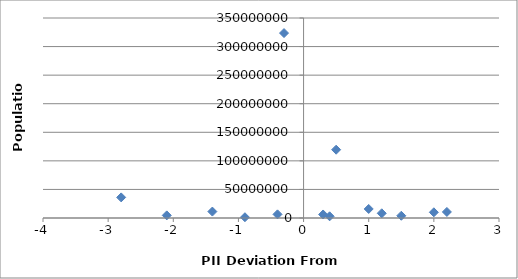
| Category | Population |
|---|---|
| -2.8 | 36048521 |
| -0.2999999999999998 | 323625762 |
| 0.5 | 119530753 |
| -1.3999999999999995 | 11238317 |
| 0.40000000000000036 | 2950210 |
| -2.0999999999999996 | 4586353 |
| 2.0 | 9980243 |
| -0.39999999999999947 | 6377195 |
| 1.0 | 15806675 |
| 2.2 | 10604000 |
| 1.2000000000000002 | 8249574 |
| 0.3000000000000007 | 6167237 |
| 1.5 | 3929141 |
| -0.8999999999999995 | 1349667 |